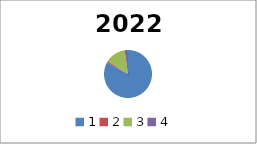
| Category | Series 0 |
|---|---|
| 1.0 | 962543.3 |
| 2.0 | 11708.44 |
| 3.0 | 158838.89 |
| 4.0 | 26077.5 |